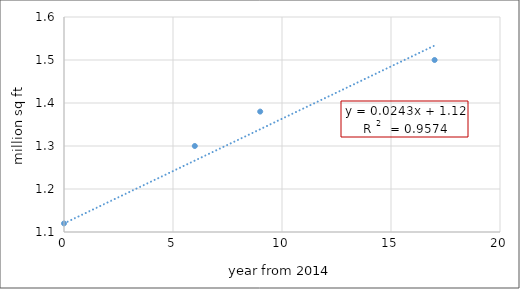
| Category | Series 0 |
|---|---|
| 0.0 | 1.12 |
| 6.0 | 1.3 |
| 9.0 | 1.38 |
| 17.0 | 1.5 |